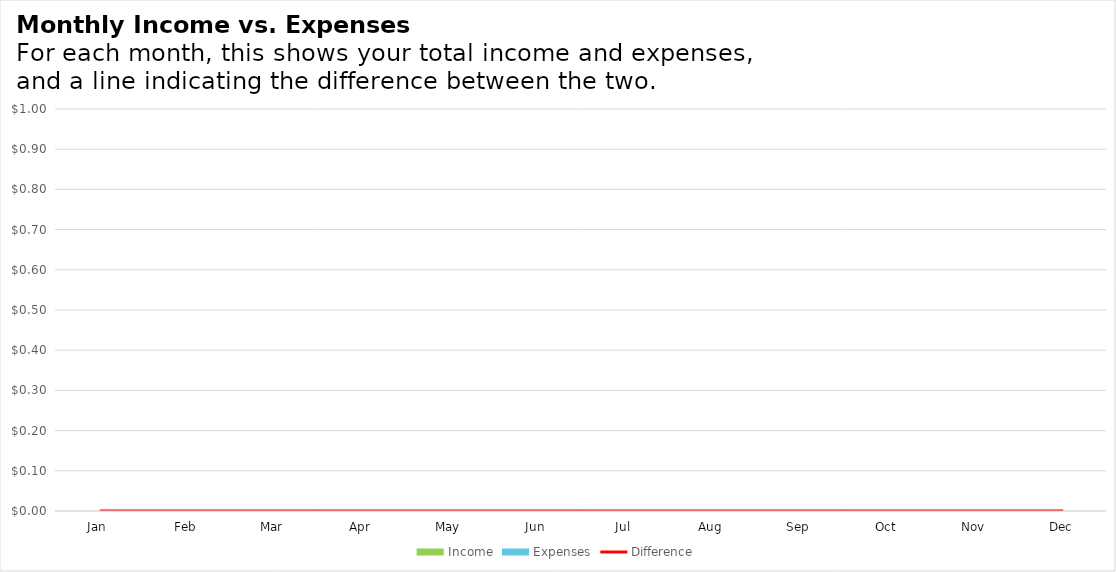
| Category | Income | Expenses |
|---|---|---|
| Jan | 0 | 0 |
| Feb | 0 | 0 |
| Mar | 0 | 0 |
| Apr | 0 | 0 |
| May | 0 | 0 |
| Jun | 0 | 0 |
| Jul | 0 | 0 |
| Aug | 0 | 0 |
| Sep | 0 | 0 |
| Oct | 0 | 0 |
| Nov | 0 | 0 |
| Dec | 0 | 0 |